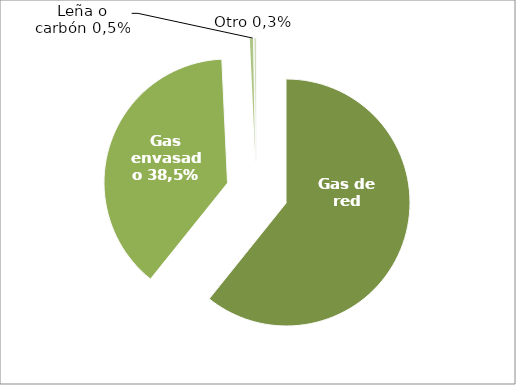
| Category | Series 0 |
|---|---|
| Gas de red | 60.731 |
| Gas envasado | 38.483 |
| Leña o carbón | 0.47 |
| Otro | 0.265 |